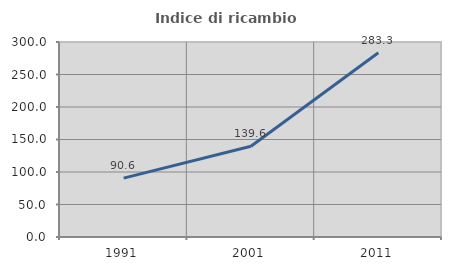
| Category | Indice di ricambio occupazionale  |
|---|---|
| 1991.0 | 90.566 |
| 2001.0 | 139.583 |
| 2011.0 | 283.333 |